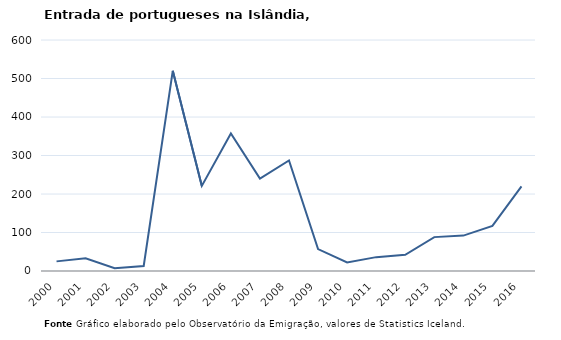
| Category | Entradas |
|---|---|
| 2000.0 | 25 |
| 2001.0 | 33 |
| 2002.0 | 7 |
| 2003.0 | 13 |
| 2004.0 | 520 |
| 2005.0 | 221 |
| 2006.0 | 357 |
| 2007.0 | 240 |
| 2008.0 | 287 |
| 2009.0 | 57 |
| 2010.0 | 22 |
| 2011.0 | 36 |
| 2012.0 | 42 |
| 2013.0 | 88 |
| 2014.0 | 92 |
| 2015.0 | 117 |
| 2016.0 | 220 |